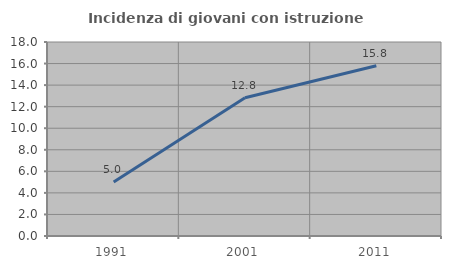
| Category | Incidenza di giovani con istruzione universitaria |
|---|---|
| 1991.0 | 5 |
| 2001.0 | 12.821 |
| 2011.0 | 15.789 |